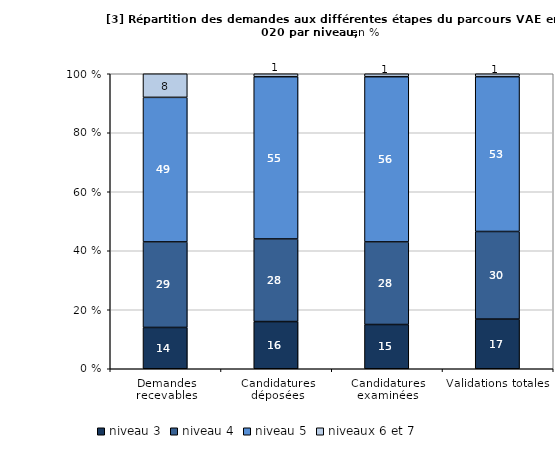
| Category | niveau 3 | niveau 4 | niveau 5 | niveaux 6 et 7 |
|---|---|---|---|---|
| Demandes recevables | 14 | 29 | 49 | 8 |
| Candidatures déposées | 16 | 28 | 55 | 1 |
| Candidatures examinées | 15 | 28 | 56 | 1 |
| Validations totales | 17 | 30 | 53 | 1 |